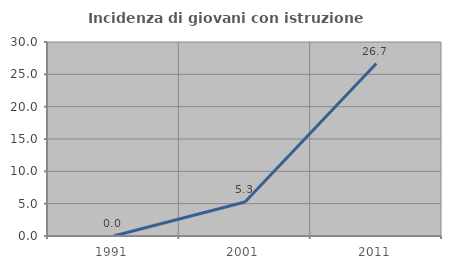
| Category | Incidenza di giovani con istruzione universitaria |
|---|---|
| 1991.0 | 0 |
| 2001.0 | 5.263 |
| 2011.0 | 26.667 |